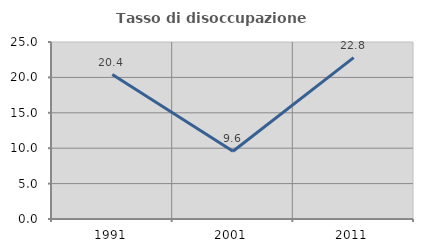
| Category | Tasso di disoccupazione giovanile  |
|---|---|
| 1991.0 | 20.408 |
| 2001.0 | 9.574 |
| 2011.0 | 22.798 |